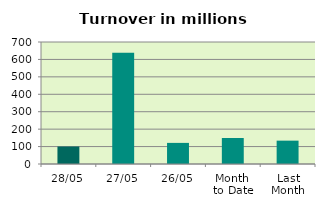
| Category | Series 0 |
|---|---|
| 28/05 | 100.388 |
| 27/05 | 638.321 |
| 26/05 | 121.119 |
| Month 
to Date | 149.036 |
| Last
Month | 133.981 |